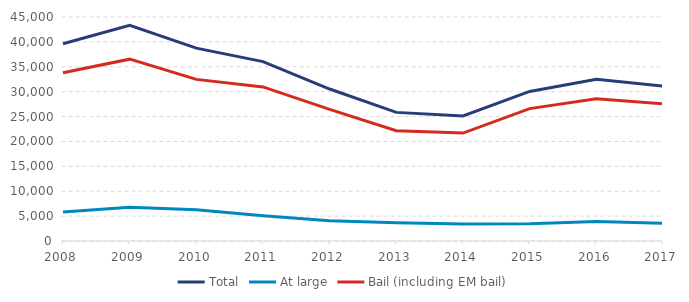
| Category | Total | At large | Bail (including EM bail) |
|---|---|---|---|
| 2008.0 | 39640 | 5838 | 33802 |
| 2009.0 | 43309 | 6780 | 36529 |
| 2010.0 | 38742 | 6274 | 32468 |
| 2011.0 | 36038 | 5085 | 30953 |
| 2012.0 | 30532 | 4091 | 26441 |
| 2013.0 | 25839 | 3688 | 22151 |
| 2014.0 | 25108 | 3423 | 21685 |
| 2015.0 | 30050 | 3450 | 26600 |
| 2016.0 | 32475 | 3893 | 28582 |
| 2017.0 | 31110 | 3548 | 27562 |